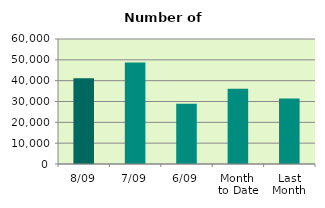
| Category | Series 0 |
|---|---|
| 8/09 | 41144 |
| 7/09 | 48714 |
| 6/09 | 28932 |
| Month 
to Date | 36133 |
| Last
Month | 31456 |